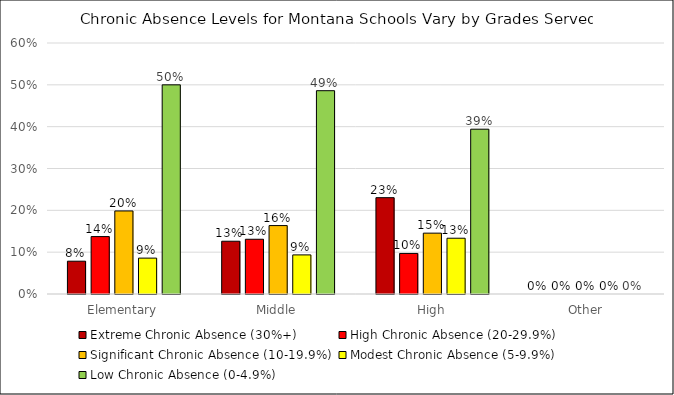
| Category | Extreme Chronic Absence (30%+) | High Chronic Absence (20-29.9%) | Significant Chronic Absence (10-19.9%) | Modest Chronic Absence (5-9.9%) | Low Chronic Absence (0-4.9%) |
|---|---|---|---|---|---|
| Elementary | 0.078 | 0.137 | 0.199 | 0.086 | 0.5 |
| Middle | 0.126 | 0.131 | 0.164 | 0.093 | 0.486 |
| High | 0.23 | 0.097 | 0.145 | 0.133 | 0.394 |
| Other | 0 | 0 | 0 | 0 | 0 |